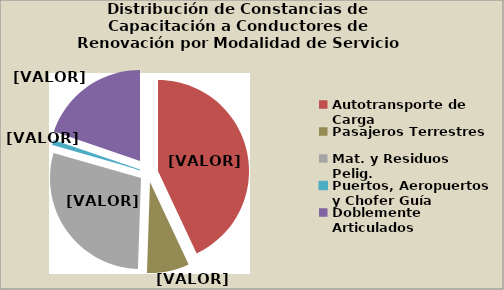
| Category | Series 0 |
|---|---|
| Autotransporte de Carga | 43.017 |
| Pasajeros Terrestres | 7.518 |
| Mat. y Residuos Pelig. | 28.881 |
| Puertos, Aeropuertos y Chofer Guía | 0.828 |
| Doblemente Articulados | 19.755 |